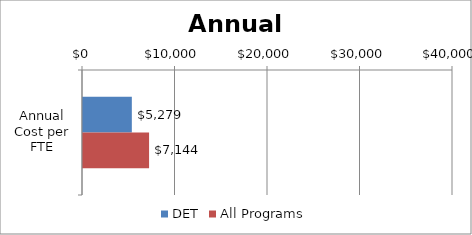
| Category | DET | All Programs |
|---|---|---|
| Annual Cost per FTE | 5279.181 | 7144 |